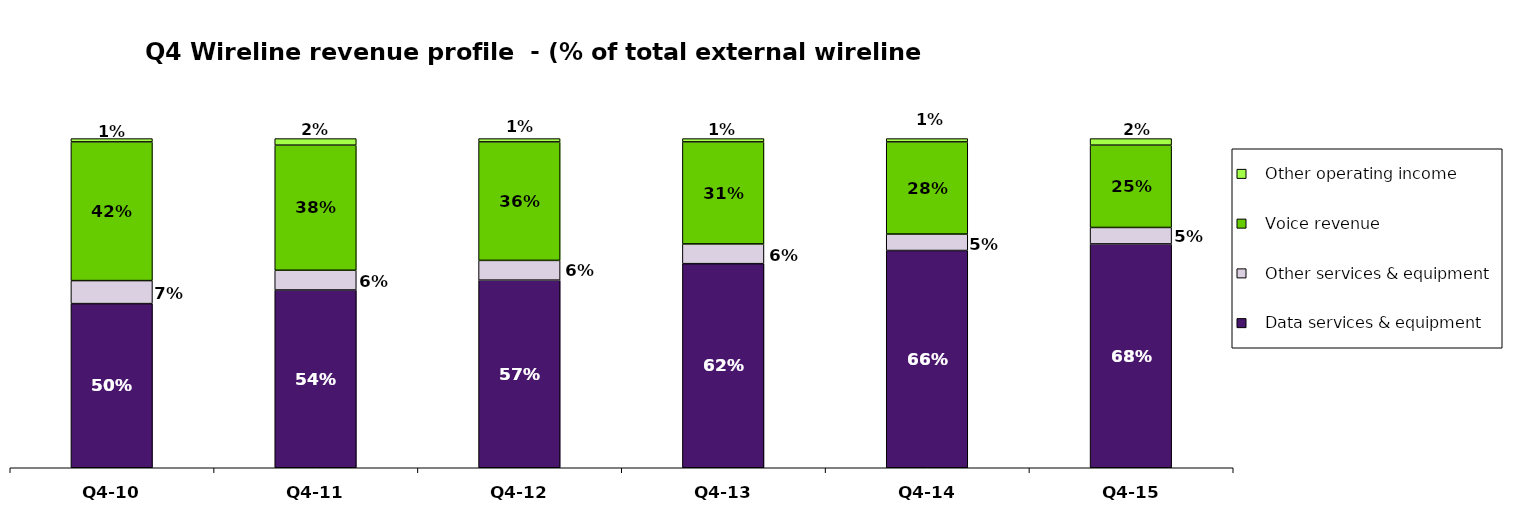
| Category |    Data services & equipment |    Other services & equipment |    Voice revenue |    Other operating income |
|---|---|---|---|---|
| Q4-10 | 0.499 | 0.07 | 0.421 | 0.01 |
| Q4-11 | 0.54 | 0.06 | 0.38 | 0.02 |
| Q4-12 | 0.57 | 0.06 | 0.36 | 0.01 |
| Q4-13 | 0.62 | 0.06 | 0.31 | 0.01 |
| Q4-14 | 0.66 | 0.05 | 0.28 | 0.01 |
| Q4-15 | 0.68 | 0.05 | 0.25 | 0.02 |